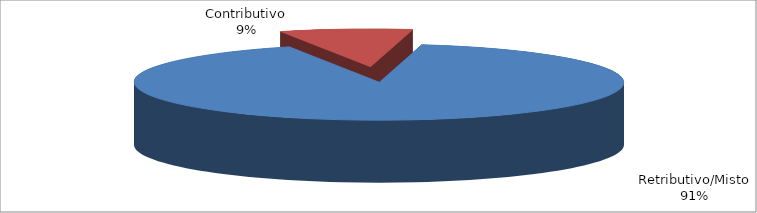
| Category | Series 1 |
|---|---|
| Retributivo/Misto | 263355 |
| Contributivo | 25264 |